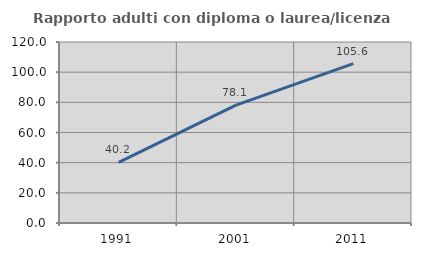
| Category | Rapporto adulti con diploma o laurea/licenza media  |
|---|---|
| 1991.0 | 40.23 |
| 2001.0 | 78.116 |
| 2011.0 | 105.634 |